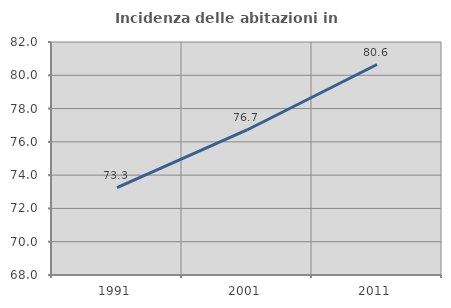
| Category | Incidenza delle abitazioni in proprietà  |
|---|---|
| 1991.0 | 73.255 |
| 2001.0 | 76.714 |
| 2011.0 | 80.647 |